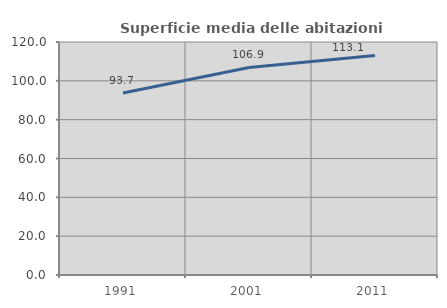
| Category | Superficie media delle abitazioni occupate |
|---|---|
| 1991.0 | 93.735 |
| 2001.0 | 106.879 |
| 2011.0 | 113.105 |